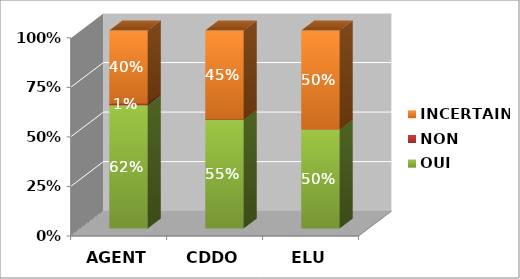
| Category | OUI | NON | INCERTAIN |
|---|---|---|---|
| AGENT | 0.622 | 0.01 | 0.398 |
| CDDO | 0.55 | 0 | 0.45 |
| ELU | 0.5 | 0 | 0.5 |